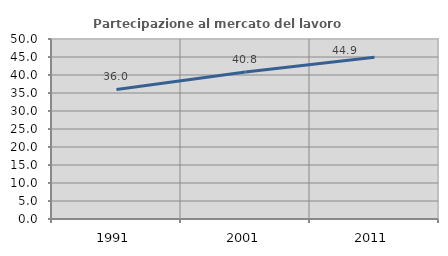
| Category | Partecipazione al mercato del lavoro  femminile |
|---|---|
| 1991.0 | 35.996 |
| 2001.0 | 40.825 |
| 2011.0 | 44.911 |